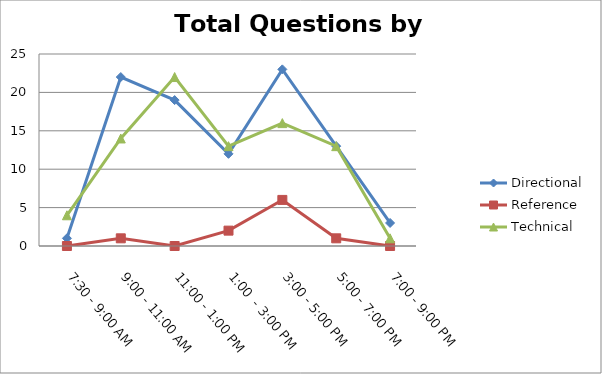
| Category | Directional | Reference | Technical |
|---|---|---|---|
| 7:30 - 9:00 AM | 1 | 0 | 4 |
| 9:00 - 11:00 AM | 22 | 1 | 14 |
| 11:00 - 1:00 PM | 19 | 0 | 22 |
| 1:00  - 3:00 PM | 12 | 2 | 13 |
| 3:00 - 5:00 PM | 23 | 6 | 16 |
| 5:00 - 7:00 PM | 13 | 1 | 13 |
| 7:00 - 9:00 PM | 3 | 0 | 1 |